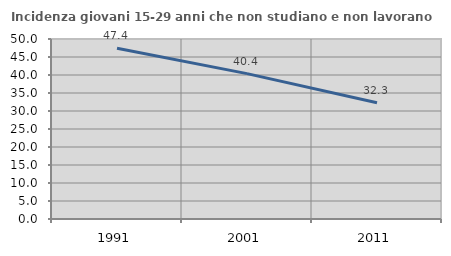
| Category | Incidenza giovani 15-29 anni che non studiano e non lavorano  |
|---|---|
| 1991.0 | 47.425 |
| 2001.0 | 40.389 |
| 2011.0 | 32.272 |